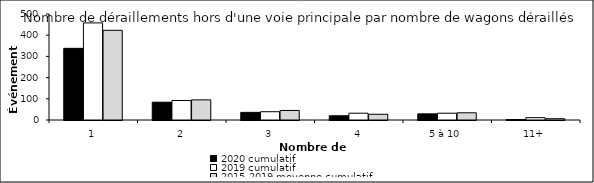
| Category | 2020 cumulatif | 2019 cumulatif | 2015-2019 moyenne cumulatif |
|---|---|---|---|
| 1 | 338 | 458 | 423 |
| 2 | 84 | 92 | 95 |
| 3 | 36 | 39 | 45 |
| 4 | 20 | 32 | 27 |
| 5 à 10 | 29 | 32 | 34 |
| 11+ | 2 | 11 | 6 |